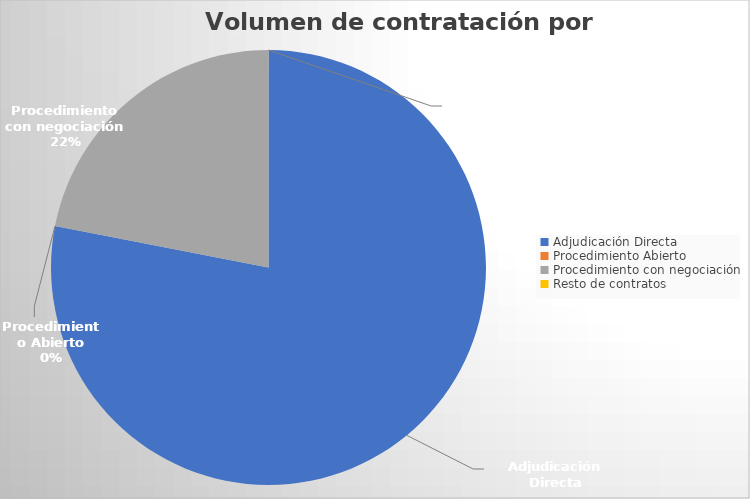
| Category | Series 0 |
|---|---|
| Adjudicación Directa | 9899.465 |
| Procedimiento Abierto | 0 |
| Procedimiento con negociación | 2783 |
| Resto de contratos | 0 |